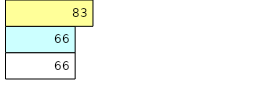
| Category | Total Standouts | Total Recd | Total Tipsters |
|---|---|---|---|
| 0 | 66 | 66 | 83 |